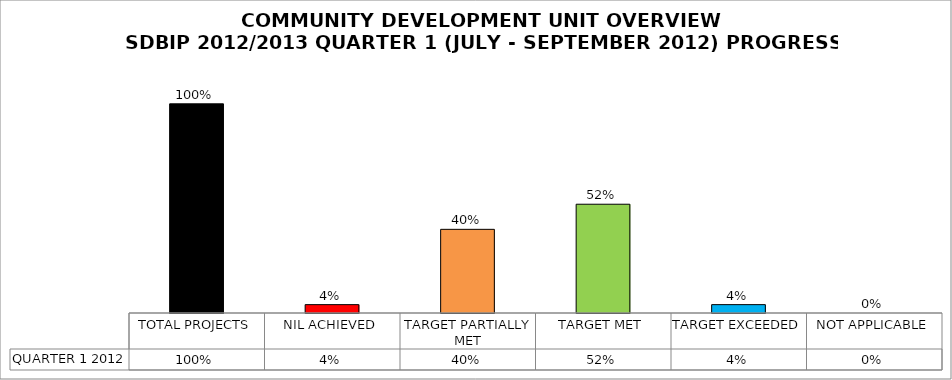
| Category | QUARTER 1 2012 |
|---|---|
| TOTAL PROJECTS | 1 |
| NIL ACHIEVED | 0.04 |
| TARGET PARTIALLY MET | 0.4 |
| TARGET MET | 0.52 |
| TARGET EXCEEDED | 0.04 |
| NOT APPLICABLE | 0 |